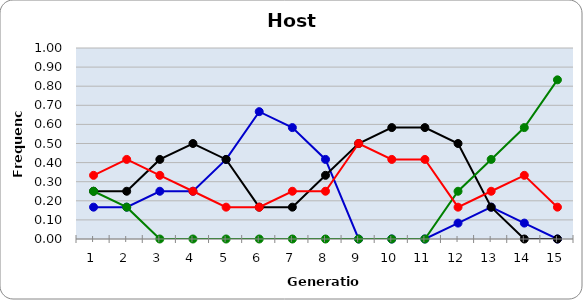
| Category | Sp | Cl | Di | He |
|---|---|---|---|---|
| 1.0 | 0.167 | 0.25 | 0.25 | 0.333 |
| 2.0 | 0.167 | 0.25 | 0.167 | 0.417 |
| 3.0 | 0.25 | 0.417 | 0 | 0.333 |
| 4.0 | 0.25 | 0.5 | 0 | 0.25 |
| 5.0 | 0.417 | 0.417 | 0 | 0.167 |
| 6.0 | 0.667 | 0.167 | 0 | 0.167 |
| 7.0 | 0.583 | 0.167 | 0 | 0.25 |
| 8.0 | 0.417 | 0.333 | 0 | 0.25 |
| 9.0 | 0 | 0.5 | 0 | 0.5 |
| 10.0 | 0 | 0.583 | 0 | 0.417 |
| 11.0 | 0 | 0.583 | 0 | 0.417 |
| 12.0 | 0.083 | 0.5 | 0.25 | 0.167 |
| 13.0 | 0.167 | 0.167 | 0.417 | 0.25 |
| 14.0 | 0.083 | 0 | 0.583 | 0.333 |
| 15.0 | 0 | 0 | 0.833 | 0.167 |